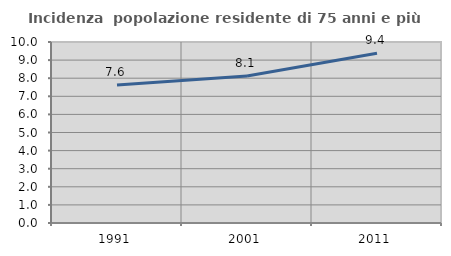
| Category | Incidenza  popolazione residente di 75 anni e più |
|---|---|
| 1991.0 | 7.628 |
| 2001.0 | 8.122 |
| 2011.0 | 9.378 |